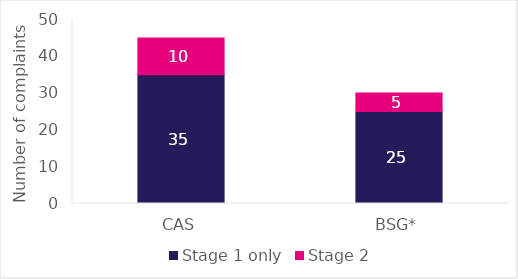
| Category | Stage 1 only | Stage 2 |
|---|---|---|
| CAS | 35 | 10 |
| BSG* | 25 | 5 |